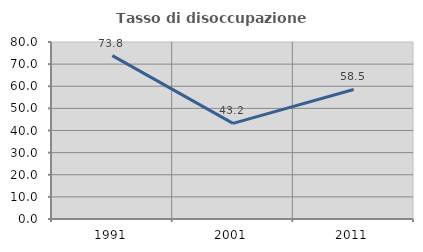
| Category | Tasso di disoccupazione giovanile  |
|---|---|
| 1991.0 | 73.832 |
| 2001.0 | 43.2 |
| 2011.0 | 58.537 |